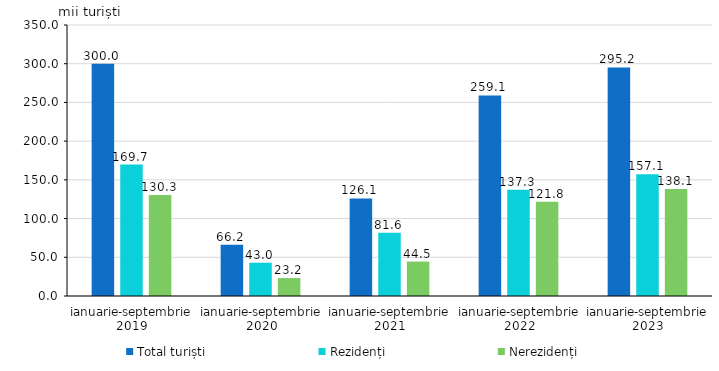
| Category | Total turiști | Rezidenți | Nerezidenți |
|---|---|---|---|
| ianuarie-septembrie 2019 | 300.026 | 169.731 | 130.295 |
| ianuarie-septembrie 2020 | 66.181 | 42.998 | 23.183 |
| ianuarie-septembrie 2021 | 126.075 | 81.607 | 44.468 |
| ianuarie-septembrie 2022 | 259.1 | 137.3 | 121.8 |
| ianuarie-septembrie 2023 | 295.2 | 157.1 | 138.1 |